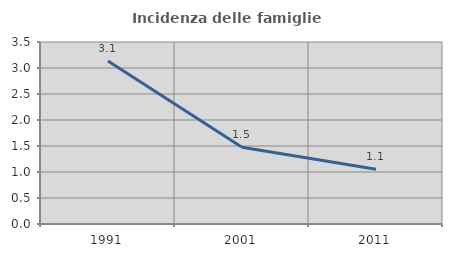
| Category | Incidenza delle famiglie numerose |
|---|---|
| 1991.0 | 3.135 |
| 2001.0 | 1.476 |
| 2011.0 | 1.053 |